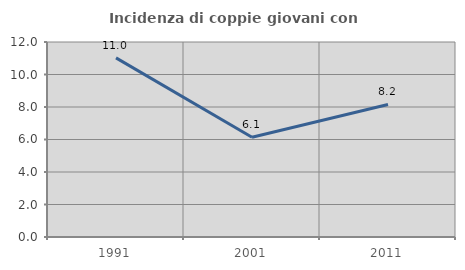
| Category | Incidenza di coppie giovani con figli |
|---|---|
| 1991.0 | 11.02 |
| 2001.0 | 6.14 |
| 2011.0 | 8.155 |